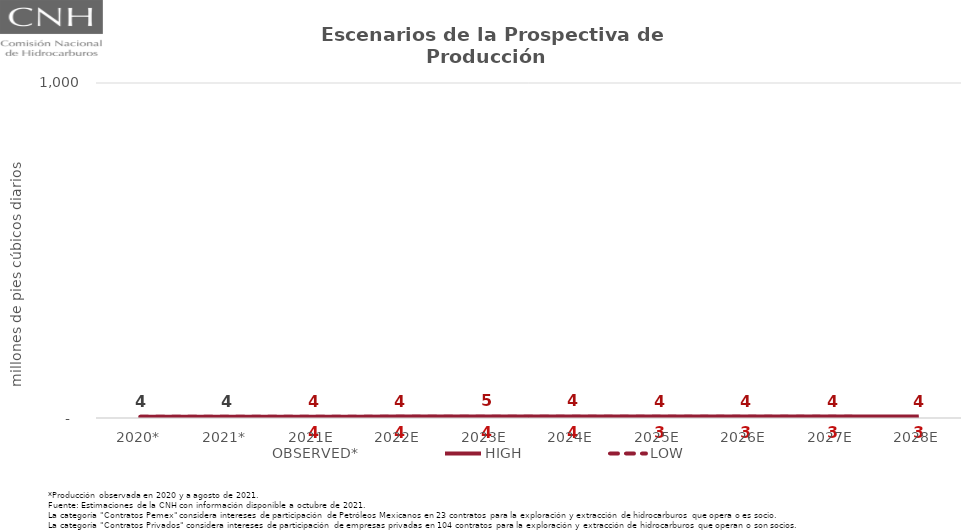
| Category | OBSERVED* | HIGH | LOW |
|---|---|---|---|
| 2020* | 3.843 | 3.843 | 3.843 |
| 2021* | 3.818 | 3.818 | 3.818 |
| 2021E | 4.007 | 4.007 | 3.78 |
| 2022E | 4.146 | 4.146 | 3.681 |
| 2023E | 4.582 | 4.582 | 3.871 |
| 2024E | 4.491 | 4.491 | 3.674 |
| 2025E | 4.371 | 4.371 | 3.499 |
| 2026E | 4.291 | 4.291 | 3.385 |
| 2027E | 4.384 | 4.384 | 3.407 |
| 2028E | 4.183 | 4.183 | 3.195 |